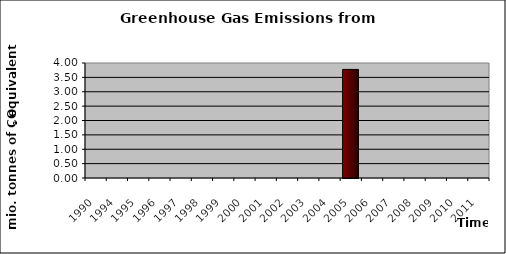
| Category | Series 0 |
|---|---|
| 1990.0 | 0 |
| 1994.0 | 0 |
| 1995.0 | 0 |
| 1996.0 | 0 |
| 1997.0 | 0 |
| 1998.0 | 0 |
| 1999.0 | 0 |
| 2000.0 | 0 |
| 2001.0 | 0 |
| 2002.0 | 0 |
| 2003.0 | 0 |
| 2004.0 | 0 |
| 2005.0 | 3.776 |
| 2006.0 | 0 |
| 2007.0 | 0 |
| 2008.0 | 0 |
| 2009.0 | 0 |
| 2010.0 | 0 |
| 2011.0 | 0 |